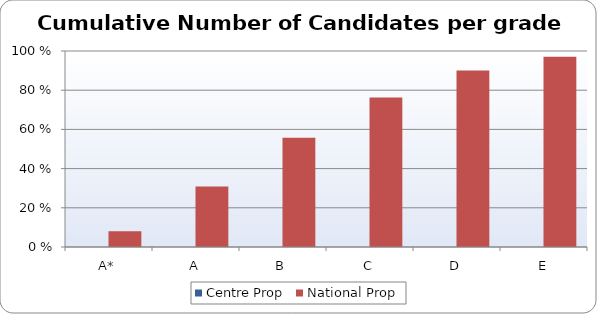
| Category | Centre Prop | National Prop |
|---|---|---|
| A* | 0 | 8.02 |
| A | 0 | 30.84 |
| B | 0 | 55.8 |
| C | 0 | 76.23 |
| D | 0 | 90.1 |
| E | 0 | 97.1 |